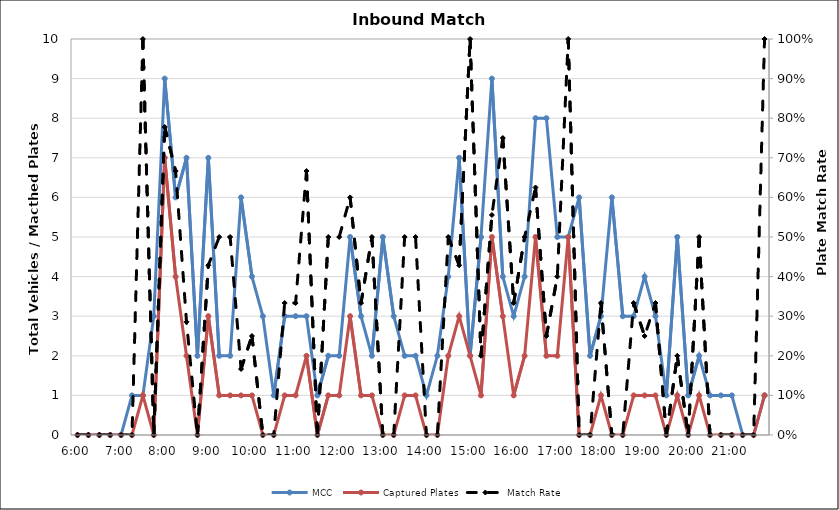
| Category | MCC | Captured Plates |
|---|---|---|
| 0.25 | 0 | 0 |
| 0.260416666666667 | 0 | 0 |
| 0.270833333333333 | 0 | 0 |
| 0.28125 | 0 | 0 |
| 0.291666666666667 | 0 | 0 |
| 0.302083333333333 | 1 | 0 |
| 0.3125 | 1 | 1 |
| 0.322916666666667 | 3 | 0 |
| 0.333333333333333 | 9 | 7 |
| 0.34375 | 6 | 4 |
| 0.354166666666667 | 7 | 2 |
| 0.364583333333333 | 2 | 0 |
| 0.375 | 7 | 3 |
| 0.385416666666667 | 2 | 1 |
| 0.395833333333333 | 2 | 1 |
| 0.40625 | 6 | 1 |
| 0.416666666666667 | 4 | 1 |
| 0.427083333333333 | 3 | 0 |
| 0.4375 | 1 | 0 |
| 0.447916666666667 | 3 | 1 |
| 0.458333333333333 | 3 | 1 |
| 0.46875 | 3 | 2 |
| 0.479166666666667 | 1 | 0 |
| 0.489583333333333 | 2 | 1 |
| 0.5 | 2 | 1 |
| 0.510416666666667 | 5 | 3 |
| 0.520833333333333 | 3 | 1 |
| 0.53125 | 2 | 1 |
| 0.541666666666667 | 5 | 0 |
| 0.552083333333333 | 3 | 0 |
| 0.5625 | 2 | 1 |
| 0.572916666666667 | 2 | 1 |
| 0.583333333333333 | 1 | 0 |
| 0.59375 | 2 | 0 |
| 0.604166666666667 | 4 | 2 |
| 0.614583333333333 | 7 | 3 |
| 0.625 | 2 | 2 |
| 0.635416666666667 | 5 | 1 |
| 0.645833333333333 | 9 | 5 |
| 0.65625 | 4 | 3 |
| 0.666666666666667 | 3 | 1 |
| 0.677083333333333 | 4 | 2 |
| 0.6875 | 8 | 5 |
| 0.697916666666667 | 8 | 2 |
| 0.708333333333333 | 5 | 2 |
| 0.71875 | 5 | 5 |
| 0.729166666666667 | 6 | 0 |
| 0.739583333333333 | 2 | 0 |
| 0.75 | 3 | 1 |
| 0.760416666666667 | 6 | 0 |
| 0.770833333333333 | 3 | 0 |
| 0.78125 | 3 | 1 |
| 0.791666666666667 | 4 | 1 |
| 0.802083333333333 | 3 | 1 |
| 0.8125 | 1 | 0 |
| 0.822916666666667 | 5 | 1 |
| 0.833333333333333 | 1 | 0 |
| 0.84375 | 2 | 1 |
| 0.854166666666667 | 1 | 0 |
| 0.864583333333333 | 1 | 0 |
| 0.875 | 1 | 0 |
| 0.885416666666667 | 0 | 0 |
| 0.895833333333333 | 0 | 0 |
| 0.90625 | 1 | 1 |